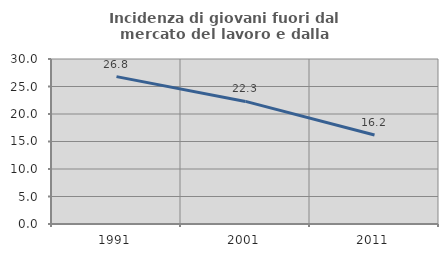
| Category | Incidenza di giovani fuori dal mercato del lavoro e dalla formazione  |
|---|---|
| 1991.0 | 26.796 |
| 2001.0 | 22.29 |
| 2011.0 | 16.181 |